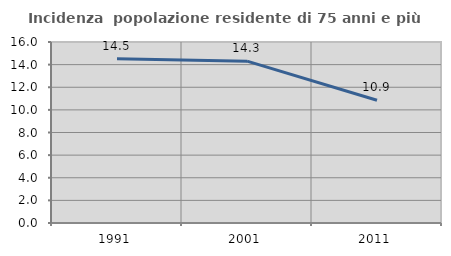
| Category | Incidenza  popolazione residente di 75 anni e più |
|---|---|
| 1991.0 | 14.514 |
| 2001.0 | 14.306 |
| 2011.0 | 10.851 |